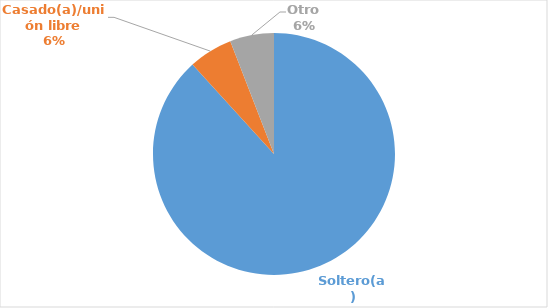
| Category | Series 0 |
|---|---|
| Soltero(a) | 0.882 |
| Casado(a)/unión libre | 0.059 |
| Otro | 0.059 |